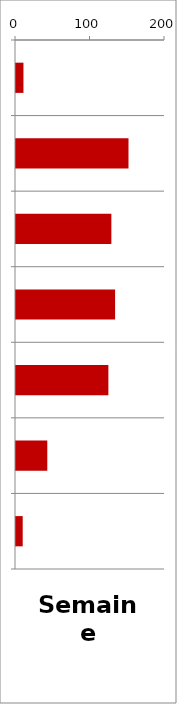
| Category | PL |
|---|---|
| 0 | 10 |
| 1 | 151 |
| 2 | 128 |
| 3 | 133 |
| 4 | 124 |
| 5 | 42 |
| 6 | 9 |